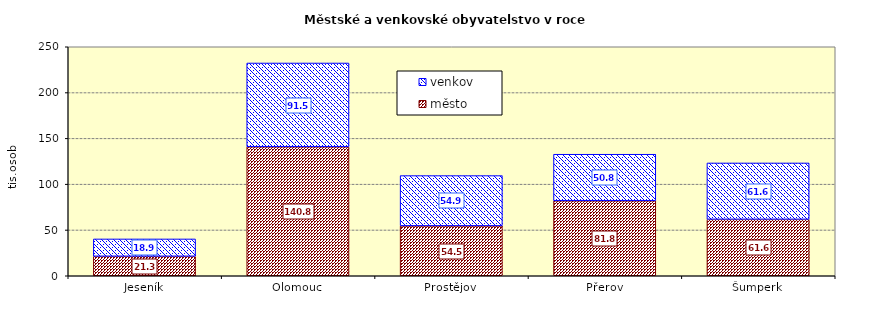
| Category | město | venkov |
|---|---|---|
| Jeseník | 21253 | 18936 |
| Olomouc | 140764 | 91503 |
| Prostějov | 54474 | 54872 |
| Přerov | 81816 | 50846 |
| Šumperk | 61580 | 61565 |